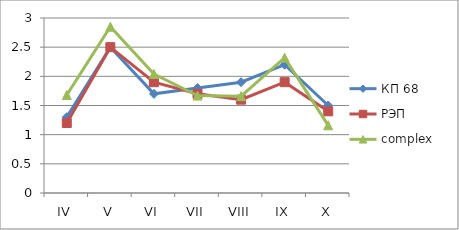
| Category | КП 68 | РЭП  | complex |
|---|---|---|---|
| IV | 1.3 | 1.2 | 1.68 |
| V | 2.5 | 2.5 | 2.85 |
| VI | 1.7 | 1.9 | 2.04 |
| VII | 1.8 | 1.7 | 1.67 |
| VIII | 1.9 | 1.6 | 1.66 |
| IX | 2.2 | 1.9 | 2.32 |
| X | 1.5 | 1.4 | 1.16 |